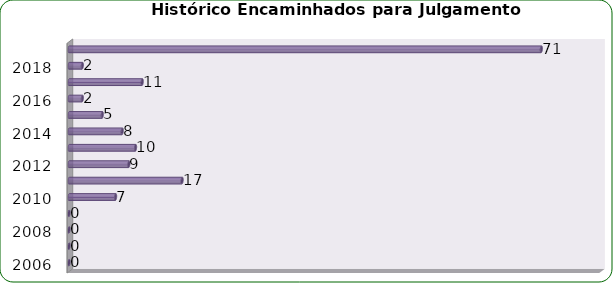
| Category | Total de Sindicâncias  |
|---|---|
| 2006 | 0 |
| 2007 | 0 |
| 2008 | 0 |
| 2009 | 0 |
| 2010 | 7 |
| 2011 | 17 |
| 2012 | 9 |
| 2013 | 10 |
| 2014 | 8 |
| 2015 | 5 |
| 2016 | 2 |
| 2017 | 11 |
| 2018 | 2 |
| Total | 71 |